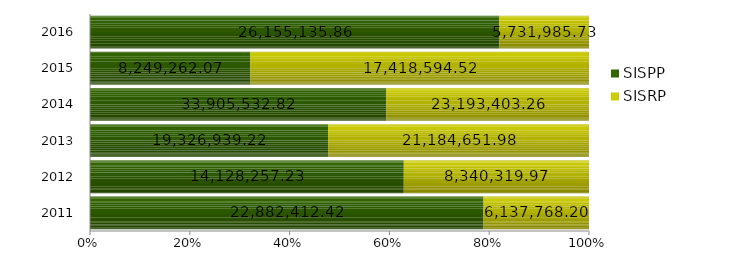
| Category | SISPP | SISRP |
|---|---|---|
| 2011.0 | 22882412.42 | 6137768.2 |
| 2012.0 | 14128257.23 | 8340319.97 |
| 2013.0 | 19326939.22 | 21184651.98 |
| 2014.0 | 33905532.82 | 23193403.26 |
| 2015.0 | 8249262.07 | 17418594.52 |
| 2016.0 | 26155135.86 | 5731985.73 |